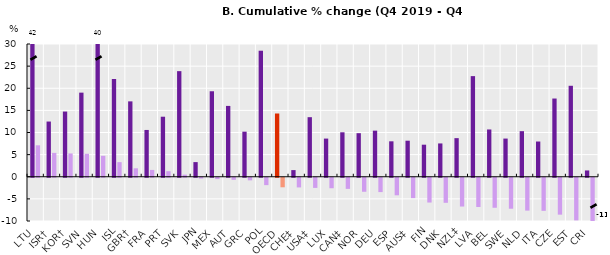
| Category | Nominal hourly wage | Real hourly wage |
|---|---|---|
| LTU | 41.89 | 7.106 |
| ISR† | 12.478 | 5.393 |
| KOR† | 14.736 | 5.263 |
| SVN | 19.008 | 5.19 |
| HUN | 39.852 | 4.731 |
| ISL | 22.086 | 3.3 |
| GBR† | 17.037 | 1.908 |
| FRA | 10.575 | 1.542 |
| PRT | 13.568 | 1.253 |
| SVK | 23.866 | 0.467 |
| JPN | 3.309 | -0.178 |
| MEX | 19.321 | -0.302 |
| AUT | 16.009 | -0.476 |
| GRC | 10.187 | -0.582 |
| POL | 28.482 | -1.668 |
| OECD | 14.292 | -2.155 |
| CHE‡ | 1.504 | -2.186 |
| USA‡ | 13.463 | -2.295 |
| LUX | 8.626 | -2.371 |
| CAN‡ | 10.048 | -2.513 |
| NOR | 9.848 | -3.168 |
| DEU | 10.419 | -3.24 |
| ESP | 8.008 | -3.966 |
| AUS‡ | 8.146 | -4.601 |
| FIN | 7.243 | -5.601 |
| DNK | 7.528 | -5.663 |
| NZL‡ | 8.724 | -6.506 |
| LVA | 22.741 | -6.606 |
| BEL | 10.685 | -6.782 |
| SWE | 8.629 | -6.998 |
| NLD | 10.302 | -7.426 |
| ITA | 7.963 | -7.482 |
| CZE | 17.678 | -8.337 |
| EST | 20.559 | -9.635 |
| CRI | 1.422 | -10.847 |